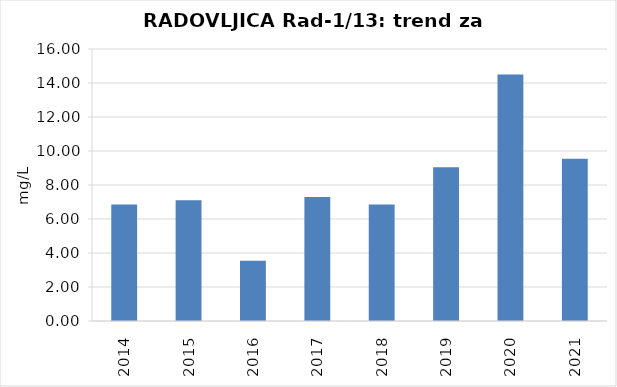
| Category | Vsota |
|---|---|
| 2014 | 6.85 |
| 2015 | 7.1 |
| 2016 | 3.55 |
| 2017 | 7.3 |
| 2018 | 6.85 |
| 2019 | 9.05 |
| 2020 | 14.5 |
| 2021 | 9.55 |